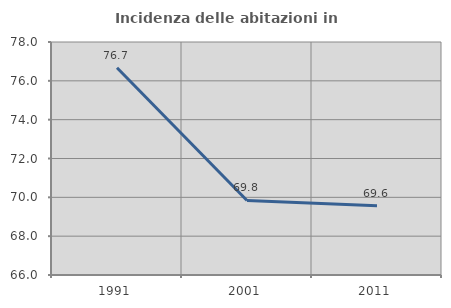
| Category | Incidenza delle abitazioni in proprietà  |
|---|---|
| 1991.0 | 76.673 |
| 2001.0 | 69.838 |
| 2011.0 | 69.57 |